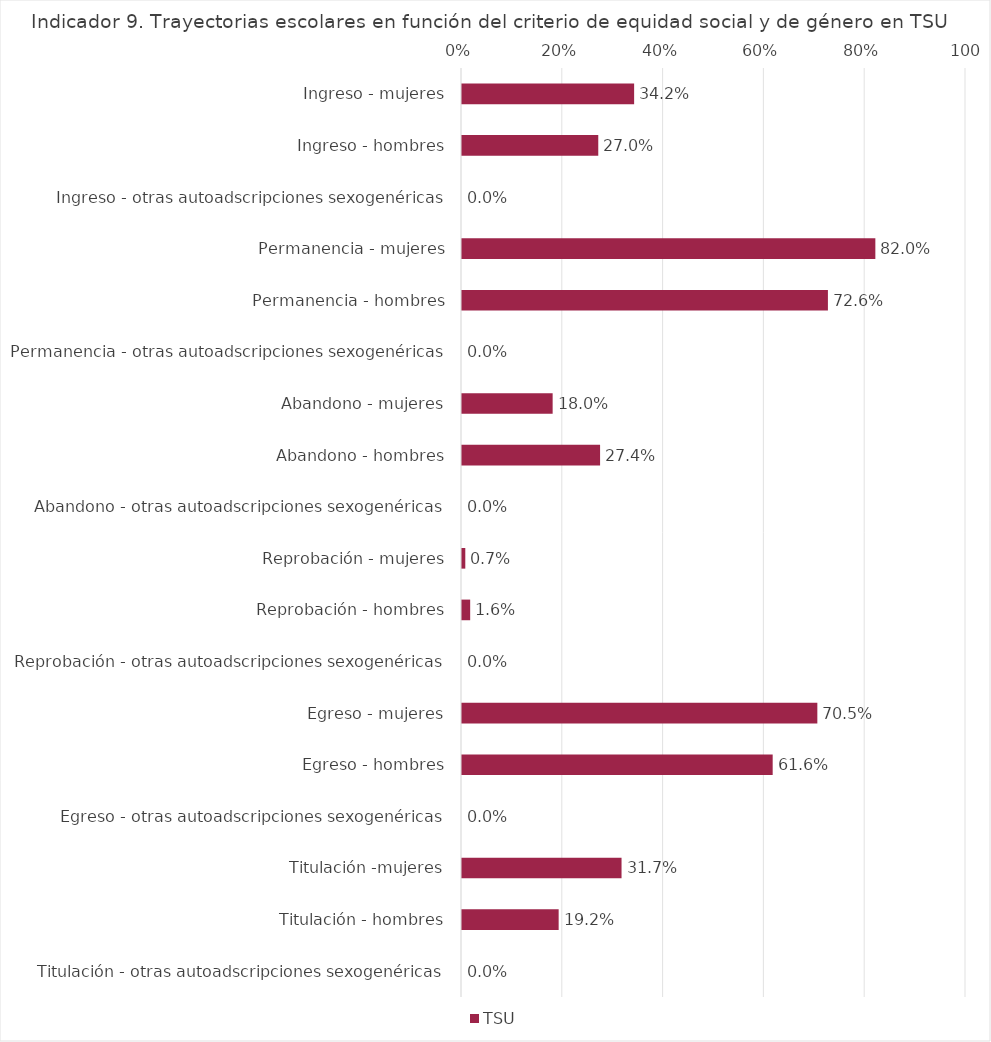
| Category | TSU |
|---|---|
| Ingreso - mujeres | 0.342 |
| Ingreso - hombres | 0.27 |
| Ingreso - otras autoadscripciones sexogenéricas | 0 |
| Permanencia - mujeres | 0.82 |
| Permanencia - hombres | 0.726 |
| Permanencia - otras autoadscripciones sexogenéricas | 0 |
| Abandono - mujeres | 0.18 |
| Abandono - hombres | 0.274 |
| Abandono - otras autoadscripciones sexogenéricas | 0 |
| Reprobación - mujeres | 0.007 |
| Reprobación - hombres | 0.016 |
| Reprobación - otras autoadscripciones sexogenéricas | 0 |
| Egreso - mujeres | 0.705 |
| Egreso - hombres | 0.616 |
| Egreso - otras autoadscripciones sexogenéricas | 0 |
| Titulación -mujeres | 0.317 |
| Titulación - hombres | 0.192 |
| Titulación - otras autoadscripciones sexogenéricas | 0 |